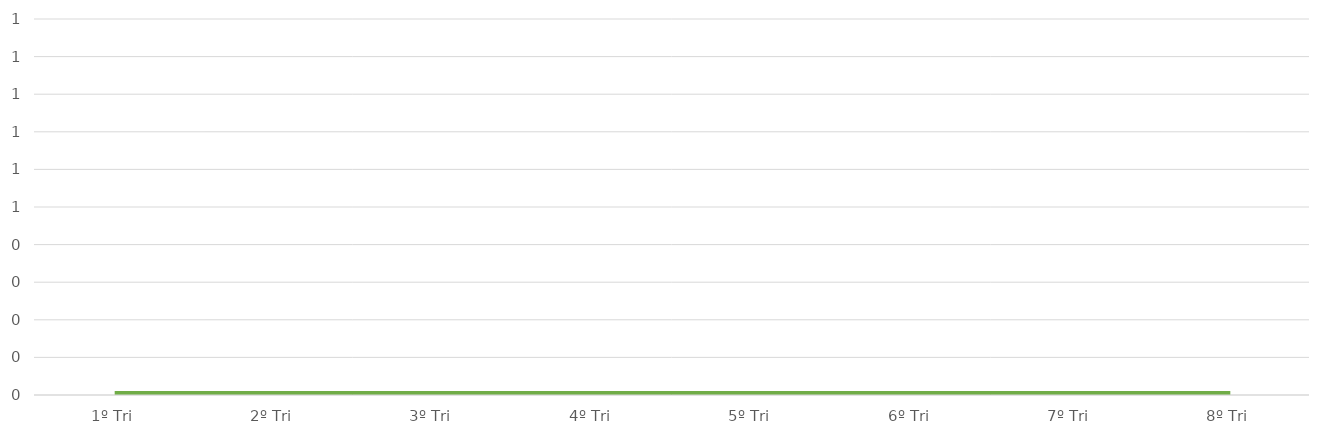
| Category | Total |
|---|---|
| 1º Tri | 0 |
| 2º Tri | 0 |
| 3º Tri | 0 |
| 4º Tri | 0 |
| 5º Tri | 0 |
| 6º Tri | 0 |
| 7º Tri | 0 |
| 8º Tri | 0 |